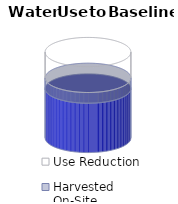
| Category | Net Utility | Harvested On-Site | Use Reduction |
|---|---|---|---|
| 0 | 0.575 | 0.125 | 0.3 |